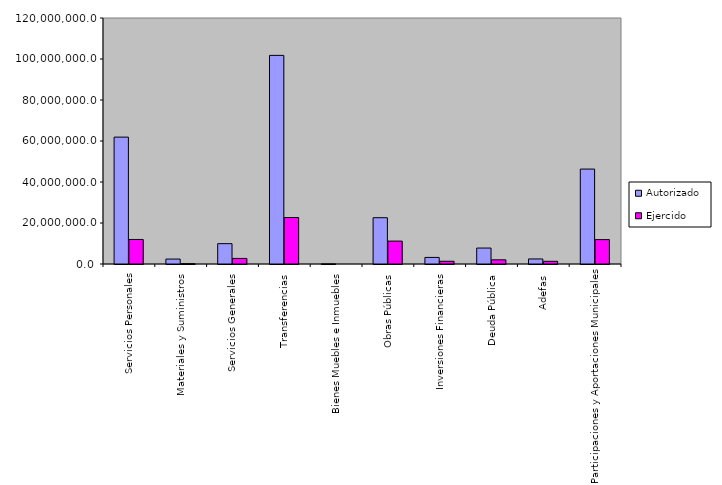
| Category | Autorizado | Ejercido |
|---|---|---|
| 0 | 61894238.6 | 11965655.3 |
| 1 | 2406740.8 | 173230.3 |
| 2 | 9921790.3 | 2714733.6 |
| 3 | 101767959.8 | 22662094.2 |
| 4 | 60079.2 | 0 |
| 5 | 22577852.5 | 11169145.8 |
| 6 | 3206035.1 | 1338320.8 |
| 7 | 7776765.5 | 2037705.9 |
| 8 | 2460661.3 | 1317464.3 |
| 9 | 46303728.5 | 11896266.4 |